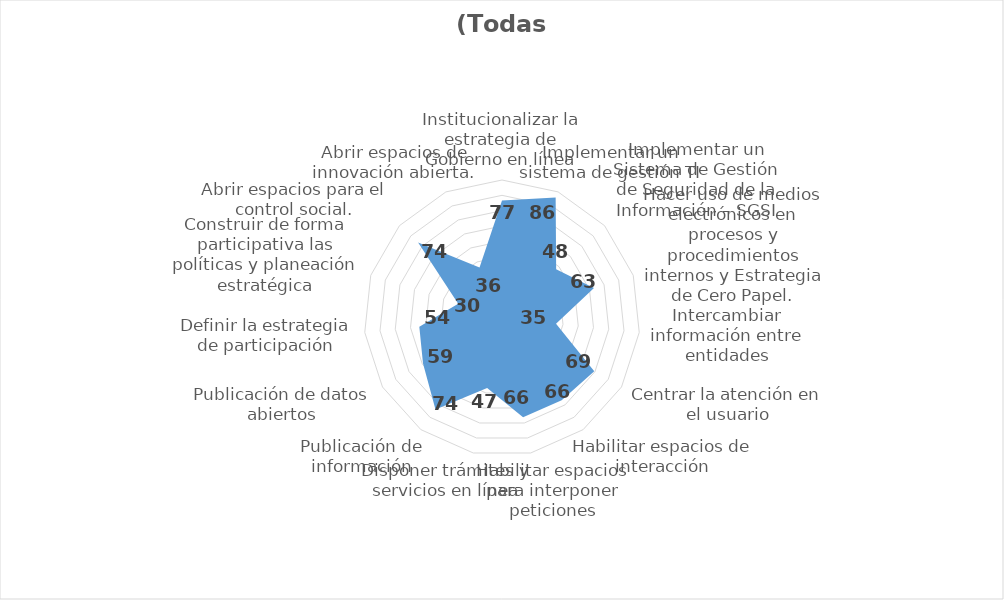
| Category | (Todas) |
|---|---|
| Institucionalizar la estrategia de Gobierno en línea | 76.666 |
| Implementar un sistema de gestión TI | 86.025 |
| Implementar un Sistema de Gestión de Seguridad de la Información – SGSI | 47.52 |
| Hacer uso de medios electrónicos en procesos y procedimientos internos y Estrategia de Cero Papel. | 63.082 |
| Intercambiar información entre entidades | 35.426 |
| Centrar la atención en el usuario | 69.478 |
| Habilitar espacios de interacción | 66.212 |
| Habilitar espacios para interponer peticiones | 66.132 |
| Disponer trámites y servicios en línea | 46.617 |
| Publicación de información | 73.786 |
| Publicación de datos abiertos | 59.48 |
| Definir la estrategia de participación | 54.219 |
| Construir de forma participativa las políticas y planeación estratégica | 30.039 |
| Abrir espacios para el control social. | 73.625 |
| Abrir espacios de innovación abierta. | 36.025 |